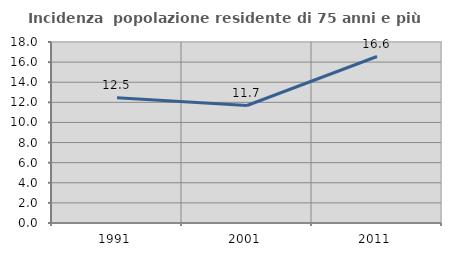
| Category | Incidenza  popolazione residente di 75 anni e più |
|---|---|
| 1991.0 | 12.456 |
| 2001.0 | 11.684 |
| 2011.0 | 16.556 |